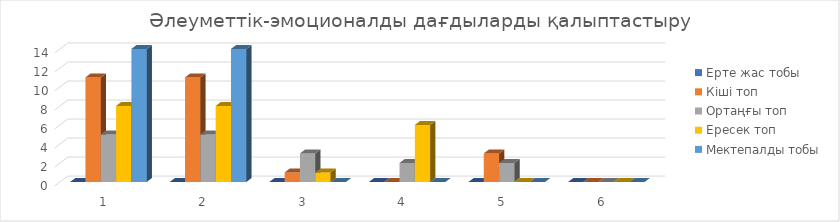
| Category | Ерте жас тобы  | Кіші топ | Ортаңғы топ | Ересек топ | Мектепалды тобы |
|---|---|---|---|---|---|
| 0 | 0 | 11 | 5 | 8 | 14 |
| 1 | 0 | 11 | 5 | 8 | 14 |
| 2 | 0 | 1 | 3 | 1 | 0 |
| 3 | 0 | 0 | 2 | 6 | 0 |
| 4 | 0 | 3 | 2 | 0 | 0 |
| 5 | 0 | 0 | 0 | 0 | 0 |